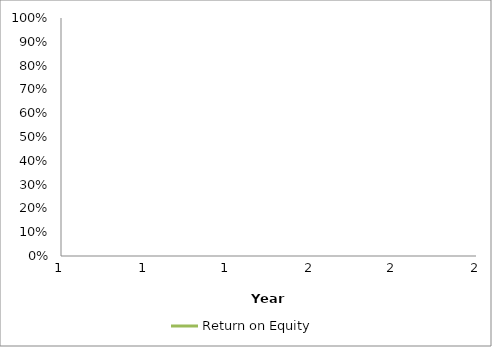
| Category | Return on Equity |
|---|---|
| 0 | 0 |
| 1 | 0 |
| 2 | 0 |
| 3 | 0 |
| 4 | 0 |
| 5 | 0 |
| 6 | 0 |
| 7 | 0 |
| 8 | 0 |
| 9 | 0 |